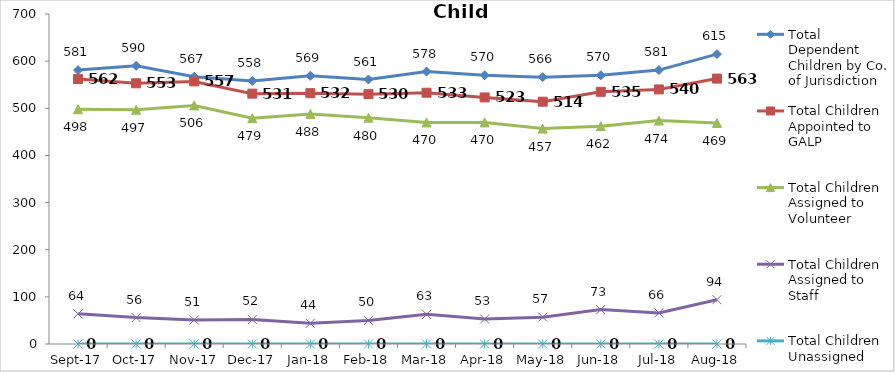
| Category | Total Dependent Children by Co. of Jurisdiction | Total Children Appointed to GALP | Total Children Assigned to Volunteer | Total Children Assigned to Staff | Total Children Unassigned |
|---|---|---|---|---|---|
| 2017-09-01 | 581 | 562 | 498 | 64 | 0 |
| 2017-10-01 | 590 | 553 | 497 | 56 | 0 |
| 2017-11-01 | 567 | 557 | 506 | 51 | 0 |
| 2017-12-01 | 558 | 531 | 479 | 52 | 0 |
| 2018-01-01 | 569 | 532 | 488 | 44 | 0 |
| 2018-02-01 | 561 | 530 | 480 | 50 | 0 |
| 2018-03-01 | 578 | 533 | 470 | 63 | 0 |
| 2018-04-01 | 570 | 523 | 470 | 53 | 0 |
| 2018-05-01 | 566 | 514 | 457 | 57 | 0 |
| 2018-06-01 | 570 | 535 | 462 | 73 | 0 |
| 2018-07-01 | 581 | 540 | 474 | 66 | 0 |
| 2018-08-01 | 615 | 563 | 469 | 94 | 0 |